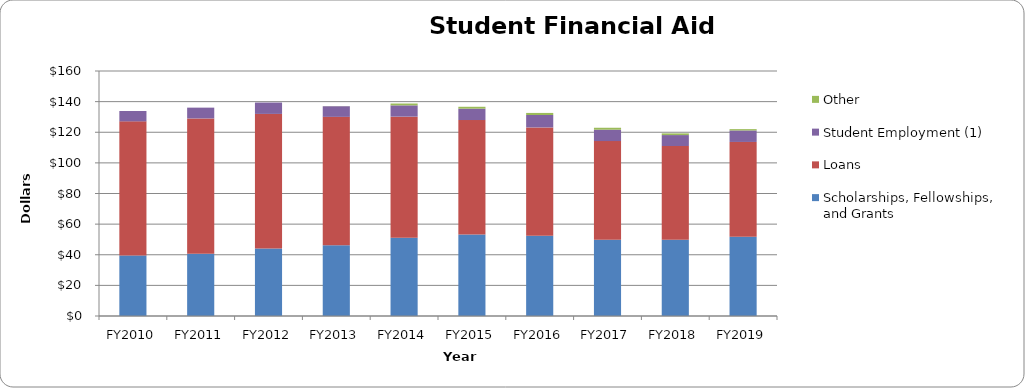
| Category | Scholarships, Fellowships, and Grants | Loans | Student Employment (1) | Other |
|---|---|---|---|---|
| FY2010 | 39474217 | 87631398 | 6791763 | 0 |
| FY2011 | 40625359 | 88396638 | 7052250 | 0 |
| FY2012 | 44102771 | 87868111 | 7426225 | 0 |
| FY2013 | 46268216 | 83785194 | 6942106 | 52224 |
| FY2014 | 51113419 | 79070857 | 7372992 | 1210671 |
| FY2015 | 53184045 | 74794479 | 7423916 | 1231168 |
| FY2016 | 52461799 | 70693766 | 8124839 | 1335993 |
| FY2017 | 49731286 | 64516160 | 7436014 | 1253025 |
| FY2018 | 49724166 | 61288014 | 7145068 | 1106538 |
| FY2019 | 51774908 | 61888292 | 7511820 | 863011 |